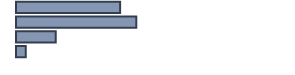
| Category | Series 0 |
|---|---|
| 0 | 38 |
| 1 | 43.9 |
| 2 | 14.5 |
| 3 | 3.6 |